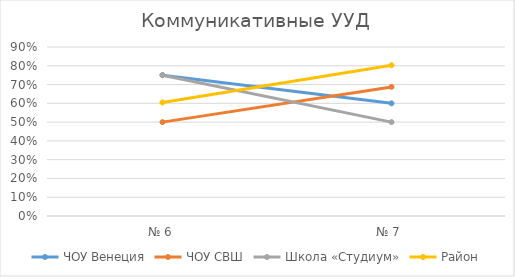
| Category | ЧОУ Венеция | ЧОУ СВШ | Школа «Студиум» | Район |
|---|---|---|---|---|
| № 6 | 0.75 | 0.5 | 0.75 | 0.605 |
| № 7 | 0.6 | 0.688 | 0.5 | 0.803 |